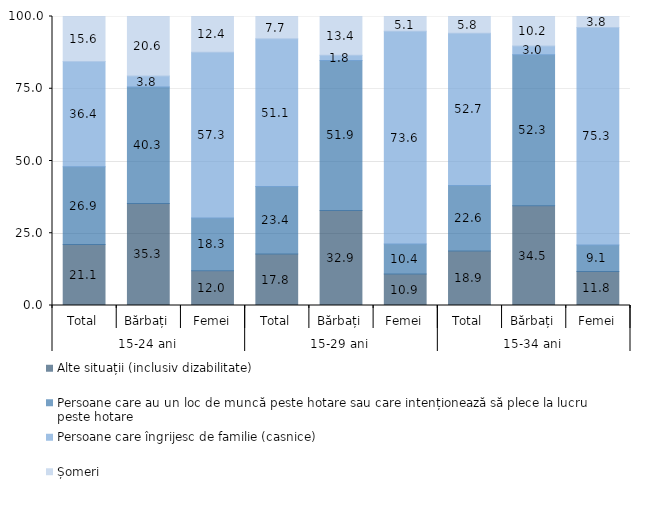
| Category | Alte situații (inclusiv dizabilitate) | Persoane care au un loc de muncă peste hotare sau care intenționează să plece la lucru peste hotare | Persoane care îngrijesc de familie (casnice) | Șomeri |
|---|---|---|---|---|
| 0 | 21.1 | 26.9 | 36.4 | 15.6 |
| 1 | 35.3 | 40.3 | 3.8 | 20.6 |
| 2 | 12 | 18.3 | 57.3 | 12.4 |
| 3 | 17.8 | 23.4 | 51.1 | 7.7 |
| 4 | 32.9 | 51.9 | 1.8 | 13.4 |
| 5 | 10.9 | 10.4 | 73.6 | 5.1 |
| 6 | 18.9 | 22.6 | 52.7 | 5.8 |
| 7 | 34.5 | 52.3 | 3 | 10.2 |
| 8 | 11.8 | 9.1 | 75.3 | 3.8 |